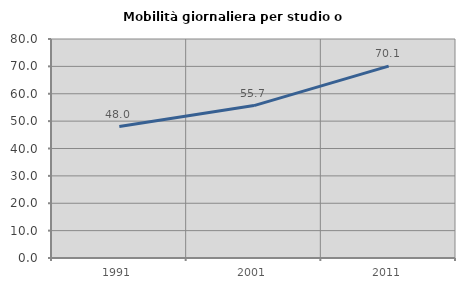
| Category | Mobilità giornaliera per studio o lavoro |
|---|---|
| 1991.0 | 48 |
| 2001.0 | 55.679 |
| 2011.0 | 70.109 |